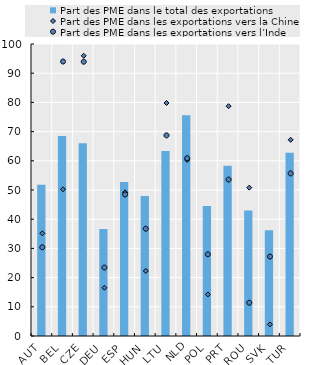
| Category | Part des PME dans le total des exportations |
|---|---|
| AUT | 51.799 |
| BEL | 68.534 |
| CZE | 65.997 |
| DEU | 36.65 |
| ESP | 52.761 |
| HUN | 47.984 |
| LTU | 63.392 |
| NLD | 75.568 |
| POL | 44.501 |
| PRT | 58.324 |
| ROU | 42.978 |
| SVK | 36.258 |
| TUR | 62.762 |